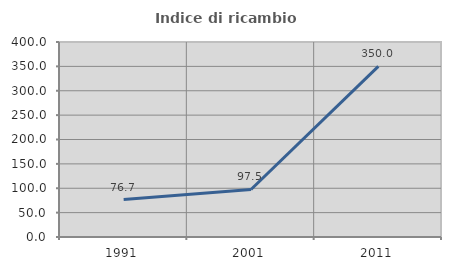
| Category | Indice di ricambio occupazionale  |
|---|---|
| 1991.0 | 76.744 |
| 2001.0 | 97.5 |
| 2011.0 | 350 |